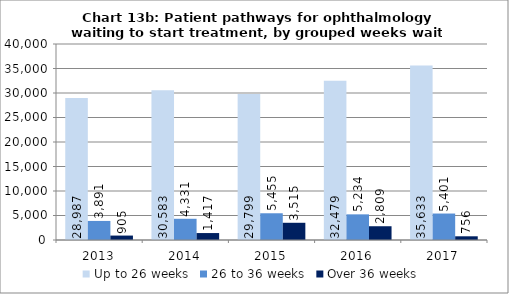
| Category | Up to 26 weeks  | 26 to 36 weeks  | Over 36 weeks  |
|---|---|---|---|
| 2013.0 | 28987 | 3891 | 905 |
| 2014.0 | 30583 | 4331 | 1417 |
| 2015.0 | 29799 | 5455 | 3515 |
| 2016.0 | 32479 | 5234 | 2809 |
| 2017.0 | 35633 | 5401 | 756 |